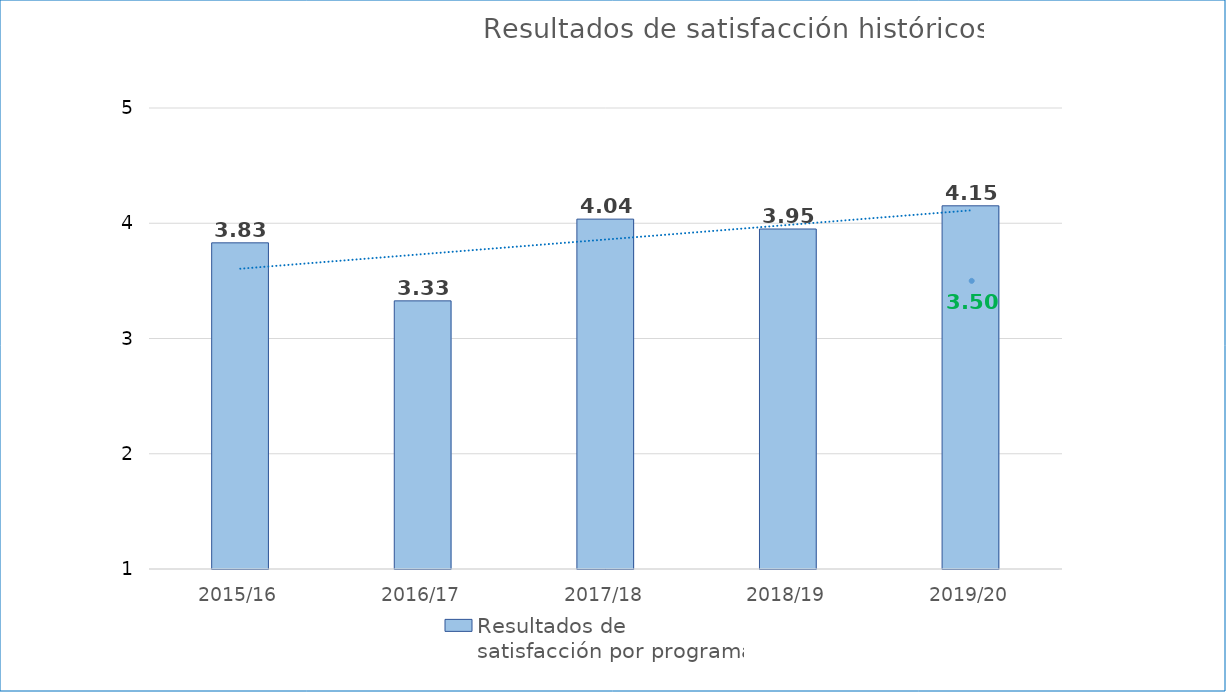
| Category | Resultados de satisfacción por programa |
|---|---|
| 2015/16 | 3.83 |
| 2016/17 | 3.326 |
| 2017/18 | 4.036 |
| 2018/19 | 3.95 |
| 2019/20 | 4.151 |